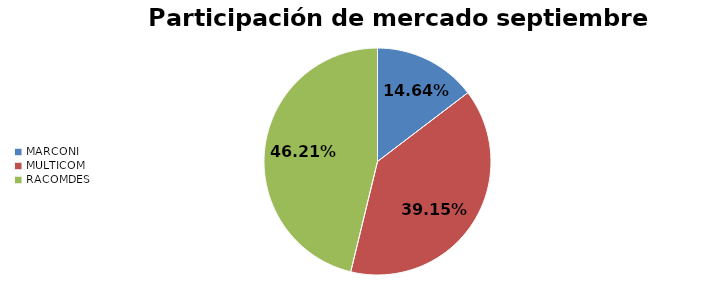
| Category | Series 0 |
|---|---|
| MARCONI | 0.146 |
| MULTICOM | 0.391 |
| RACOMDES | 0.462 |